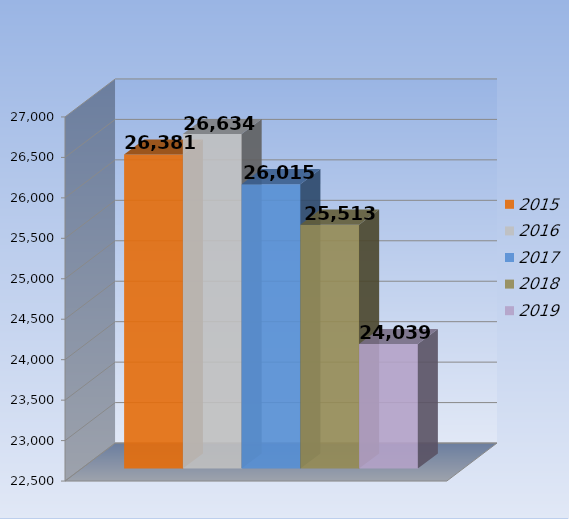
| Category | 2015 | 2016 | 2017 | 2018 | 2019 |
|---|---|---|---|---|---|
| 0 | 26381 | 26634 | 26015 | 25513 | 24039 |